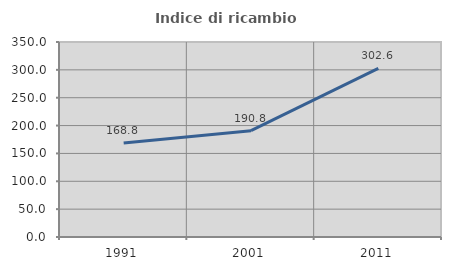
| Category | Indice di ricambio occupazionale  |
|---|---|
| 1991.0 | 168.75 |
| 2001.0 | 190.816 |
| 2011.0 | 302.597 |